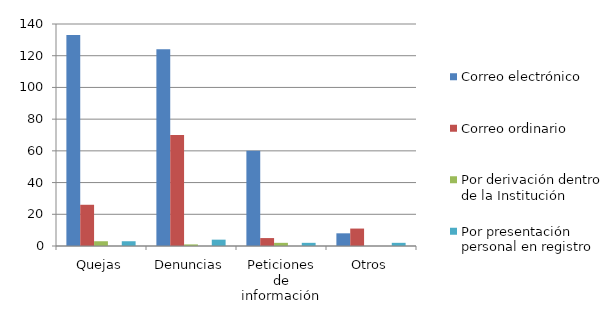
| Category | Correo electrónico  | Correo ordinario | Por derivación dentro de la Institución | Por FAX | Por presentación personal en registro |
|---|---|---|---|---|---|
| Quejas | 133 | 26 | 3 | 0 | 3 |
| Denuncias | 124 | 70 | 1 | 0 | 4 |
| Peticiones de información | 60 | 5 | 2 | 0 | 2 |
| Otros | 8 | 11 | 0 | 0 | 2 |